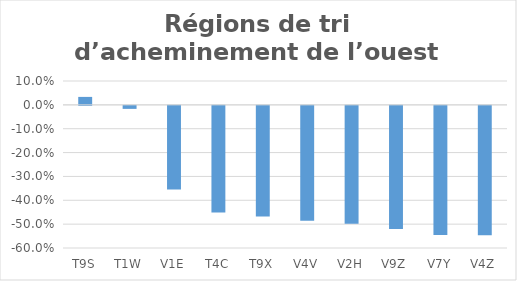
| Category | Series 0 |
|---|---|
| T9S | 0.033 |
| T1W | -0.013 |
| V1E | -0.351 |
| T4C | -0.447 |
| T9X | -0.464 |
| V4V | -0.481 |
| V2H | -0.494 |
| V9Z | -0.516 |
| V7Y | -0.541 |
| V4Z | -0.543 |